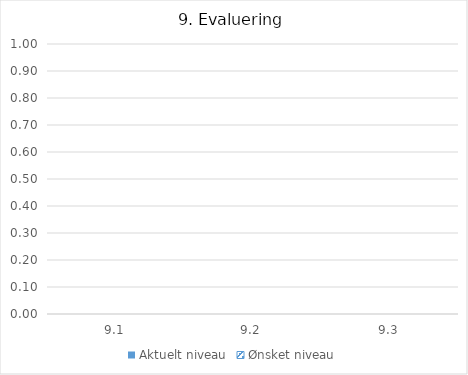
| Category | Aktuelt niveau | Ønsket niveau |
|---|---|---|
| 9.1 | 0 | 0 |
| 9.2 | 0 | 0 |
| 9.3 | 0 | 0 |